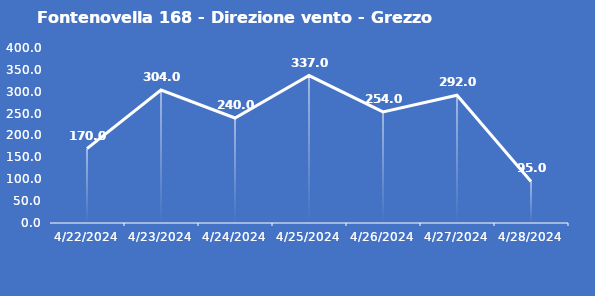
| Category | Fontenovella 168 - Direzione vento - Grezzo (°N) |
|---|---|
| 4/22/24 | 170 |
| 4/23/24 | 304 |
| 4/24/24 | 240 |
| 4/25/24 | 337 |
| 4/26/24 | 254 |
| 4/27/24 | 292 |
| 4/28/24 | 95 |